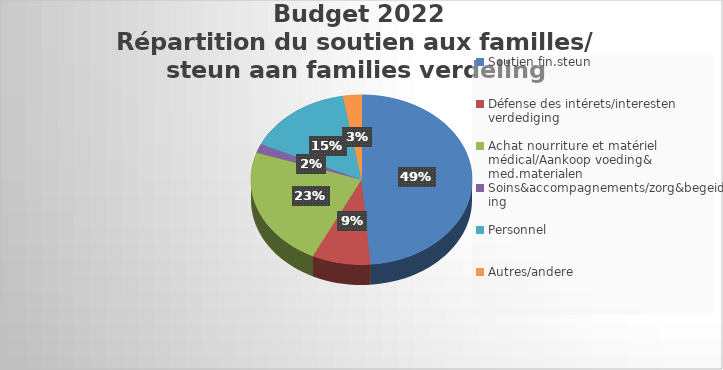
| Category | Series 0 |
|---|---|
| Soutien fin.steun | 776451 |
| Défense des intérets/interesten verdediging | 135885 |
| Achat nourriture et matériel médical/Aankoop voeding& med.materialen | 365719 |
| Soins&accompagnements/zorg&begeiding | 27500 |
| Personnel | 245822 |
| Autres/andere | 43000 |